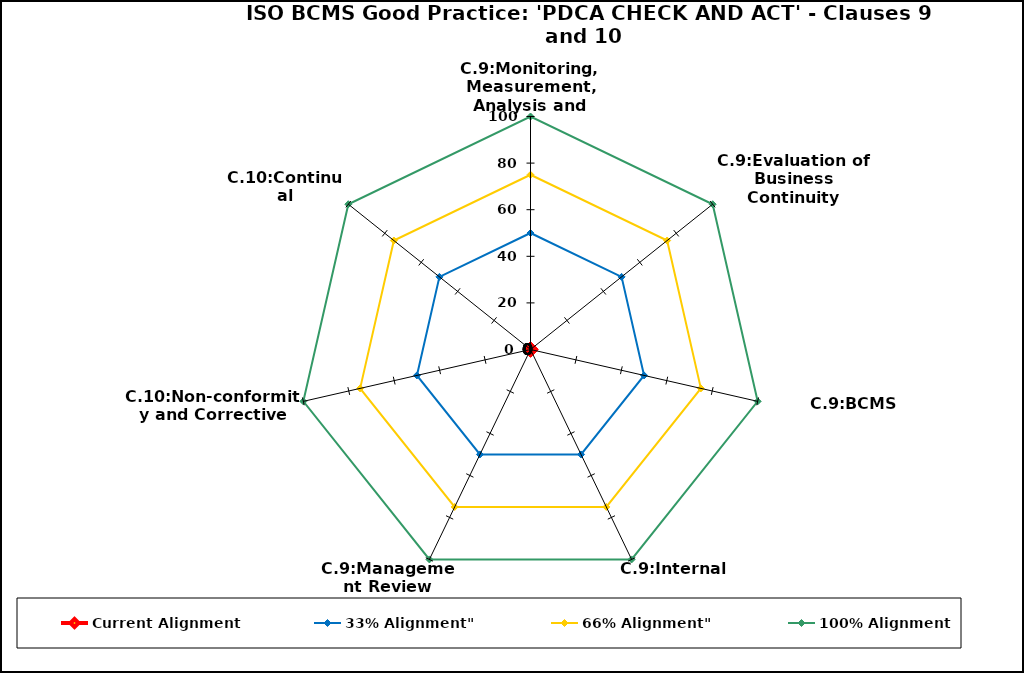
| Category | Current Alignment | 33% Alignment" | 66% Alignment" | 100% Alignment |
|---|---|---|---|---|
| C.9:Monitoring, Measurement, Analysis and Evaluation | 0 | 50 | 75 | 100 |
| C.9:Evaluation of Business Continuity Procedures | 0 | 50 | 75 | 100 |
| C.9:BCMS Maintenance | 0 | 50 | 75 | 100 |
| C.9:Internal Audit | 0 | 50 | 75 | 100 |
| C.9:Management Review | 0 | 50 | 75 | 100 |
| C.10:Non-conformity and Corrective Action | 0 | 50 | 75 | 100 |
| C.10:Continual Improvement | 0 | 50 | 75 | 100 |